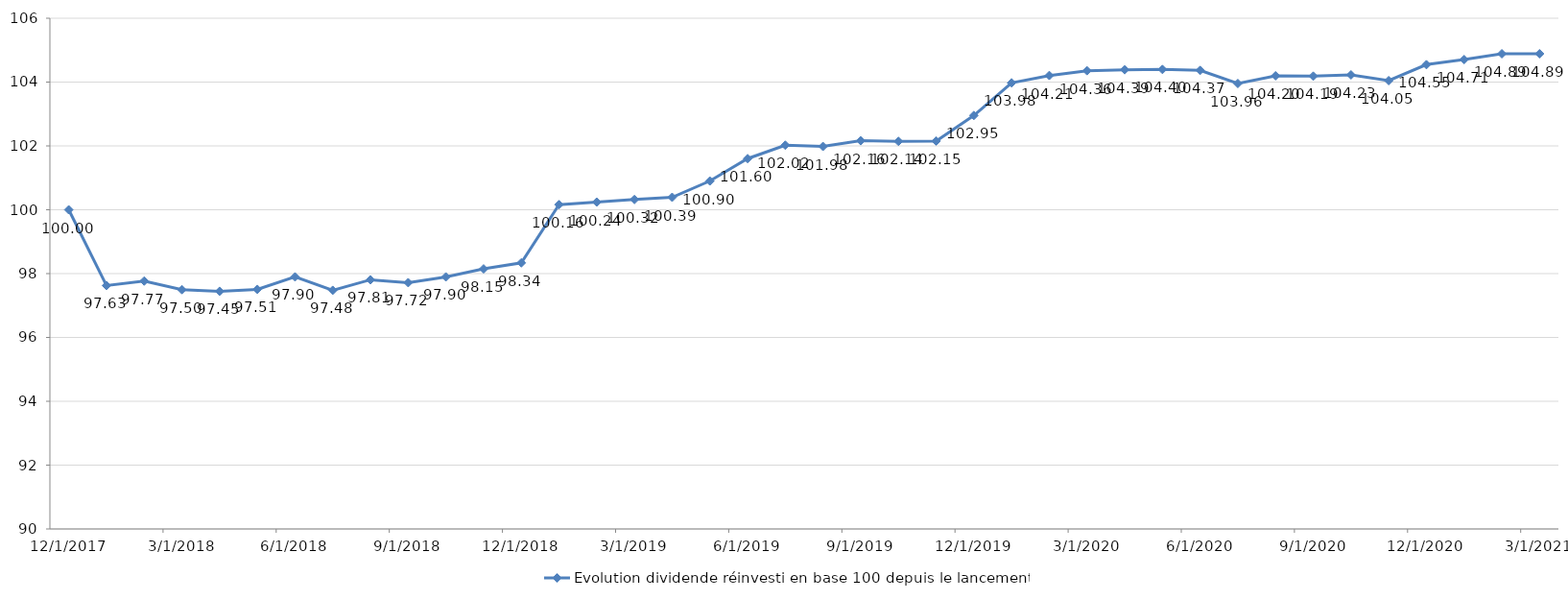
| Category |  Evolution dividende réinvesti en base 100 depuis le lancement  |
|---|---|
| 12/1/17 | 100 |
| 1/1/18 | 97.627 |
| 2/1/18 | 97.767 |
| 3/1/18 | 97.496 |
| 4/1/18 | 97.446 |
| 5/1/18 | 97.507 |
| 6/1/18 | 97.897 |
| 7/1/18 | 97.476 |
| 8/1/18 | 97.807 |
| 9/1/18 | 97.717 |
| 10/1/18 | 97.897 |
| 11/1/18 | 98.147 |
| 12/1/18 | 98.338 |
| 1/1/19 | 100.16 |
| 2/1/19 | 100.24 |
| 3/1/19 | 100.32 |
| 4/1/19 | 100.391 |
| 5/1/19 | 100.901 |
| 6/1/19 | 101.602 |
| 7/1/19 | 102.023 |
| 8/1/19 | 101.983 |
| 9/1/19 | 102.163 |
| 10/1/19 | 102.143 |
| 11/1/19 | 102.153 |
| 12/1/19 | 102.954 |
| 1/1/20 | 103.976 |
| 2/1/20 | 104.206 |
| 3/1/20 | 104.356 |
| 4/1/20 | 104.386 |
| 5/1/20 | 104.396 |
| 6/1/20 | 104.366 |
| 7/1/20 | 103.956 |
| 8/1/20 | 104.196 |
| 9/1/20 | 104.186 |
| 10/1/20 | 104.226 |
| 11/1/20 | 104.046 |
| 12/1/20 | 104.546 |
| 1/1/21 | 104.707 |
| 2/1/21 | 104.887 |
| 3/1/21 | 104.887 |